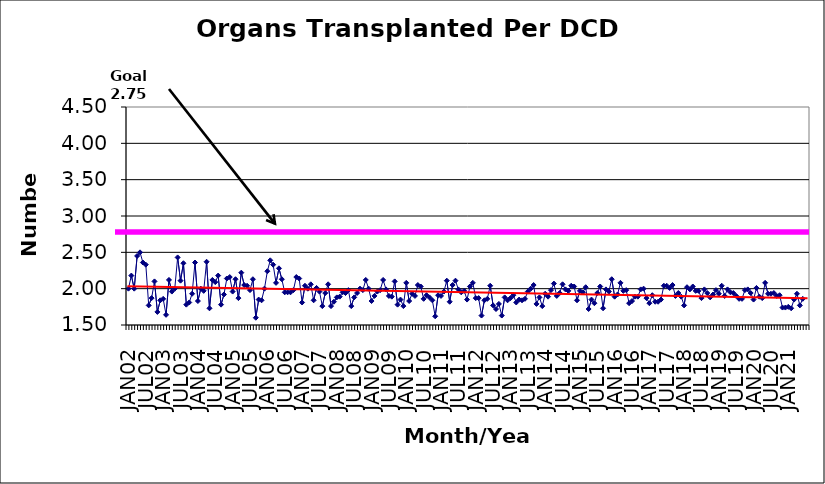
| Category | Series 0 |
|---|---|
| JAN02 | 2 |
| FEB02 | 2.18 |
| MAR02 | 2 |
| APR02 | 2.45 |
| MAY02 | 2.5 |
| JUN02 | 2.36 |
| JUL02 | 2.33 |
| AUG02 | 1.77 |
| SEP02 | 1.87 |
| OCT02 | 2.1 |
| NOV02 | 1.68 |
| DEC02 | 1.84 |
| JAN03 | 1.86 |
| FEB03 | 1.64 |
| MAR03 | 2.12 |
| APR03 | 1.96 |
| MAY03 | 2 |
| JUN03 | 2.43 |
| JUL03 | 2.11 |
| AUG03 | 2.35 |
| SEP03 | 1.78 |
| OCT03 | 1.81 |
| NOV03 | 1.93 |
| DEC03 | 2.36 |
| JAN04 | 1.83 |
| FEB04 | 2 |
| MAR04 | 1.97 |
| APR04 | 2.37 |
| MAY04 | 1.73 |
| JUN04 | 2.12 |
| JUL04 | 2.09 |
| AUG04 | 2.18 |
| SEP04 | 1.78 |
| OCT04 | 1.92 |
| NOV04 | 2.14 |
| DEC04 | 2.16 |
| JAN05 | 1.96 |
| FEB05 | 2.13 |
| MAR05 | 1.87 |
| APR05 | 2.22 |
| MAY05 | 2.05 |
| JUN05 | 2.04 |
| JUL05 | 1.98 |
| AUG05 | 2.13 |
| SEP05 | 1.6 |
| OCT05 | 1.85 |
| NOV05 | 1.84 |
| DEC05 | 2 |
| JAN06 | 2.24 |
| FEB06 | 2.39 |
| MAR06 | 2.33 |
| APR06 | 2.08 |
| MAY06 | 2.28 |
| JUN06 | 2.13 |
| JUL06 | 1.95 |
| AUG06 | 1.95 |
| SEP06 | 1.95 |
| OCT06 | 1.98 |
| NOV06 | 2.16 |
| DEC06 | 2.14 |
| JAN07 | 1.81 |
| FEB07 | 2.04 |
| MAR07 | 2 |
| APR07 | 2.06 |
| MAY07 | 1.84 |
| JUN07 | 2.01 |
| JUL07 | 1.96 |
| AUG07 | 1.76 |
| SEP07 | 1.94 |
| OCT07 | 2.06 |
| NOV07 | 1.76 |
| DEC07 | 1.82 |
| JAN08 | 1.88 |
| FEB08 | 1.89 |
| MAR08 | 1.95 |
| APR08 | 1.94 |
| MAY08 | 1.98 |
| JUN08 | 1.76 |
| JUL08 | 1.88 |
| AUG08 | 1.94 |
| SEP08 | 2 |
| OCT08 | 1.98 |
| NOV08 | 2.12 |
| DEC08 | 2 |
| JAN09 | 1.83 |
| FEB09 | 1.9 |
| MAR09 | 1.96 |
| APR09 | 1.98 |
| MAY09 | 2.12 |
| JUN09 | 1.99 |
| JUL09 | 1.9 |
| AUG09 | 1.89 |
| SEP09 | 2.1 |
| OCT09 | 1.78 |
| NOV09 | 1.85 |
| DEC09 | 1.76 |
| JAN10 | 2.08 |
| FEB10 | 1.83 |
| MAR10 | 1.93 |
| APR10 | 1.9 |
| MAY10 | 2.05 |
| JUN10 | 2.03 |
| JUL10 | 1.86 |
| AUG10 | 1.91 |
| SEP10 | 1.88 |
| OCT10 | 1.84 |
| NOV10 | 1.62 |
| DEC10 | 1.91 |
| JAN11 | 1.9 |
| FEB11 | 1.96 |
| MAR11 | 2.11 |
| APR11 | 1.82 |
| MAY11 | 2.05 |
| JUN11 | 2.11 |
| JUL11 | 1.99 |
| AUG11 | 1.95 |
| SEP11 | 1.97 |
| OCT11 | 1.85 |
| NOV11 | 2.03 |
| DEC11 | 2.08 |
| JAN12 | 1.87 |
| FEB12 | 1.87 |
| MAR12 | 1.63 |
| APR12 | 1.84 |
| MAY12 | 1.86 |
| JUN12 | 2.04 |
| JUL12 | 1.77 |
| AUG12 | 1.72 |
| SEP12 | 1.79 |
| OCT12 | 1.63 |
| NOV12 | 1.88 |
| DEC12 | 1.84 |
| JAN13 | 1.87 |
| FEB13 | 1.91 |
| MAR13 | 1.81 |
| APR13 | 1.85 |
| MAY13 | 1.84 |
| JUN13 | 1.86 |
| JUL13 | 1.96 |
| AUG13 | 2 |
| SEP13 | 2.05 |
| OCT13 | 1.79 |
| NOV13 | 1.88 |
| DEC13 | 1.76 |
| JAN14 | 1.93 |
| FEB14 | 1.89 |
| MAR14 | 1.98 |
| APR14 | 2.07 |
| MAY14 | 1.9 |
| JUN14 | 1.94 |
| JUL14 | 2.06 |
| AUG14 | 1.99 |
| SEP14 | 1.97 |
| OCT14 | 2.04 |
| NOV14 | 2.03 |
| DEC14 | 1.84 |
| JAN15 | 1.97 |
| FEB15 | 1.95 |
| MAR15 | 2.02 |
| APR15 | 1.72 |
| MAY15 | 1.85 |
| JUN15 | 1.8 |
| JUL15 | 1.94 |
| AUG15 | 2.03 |
| SEP15 | 1.73 |
| OCT15 | 1.99 |
| NOV15 | 1.96 |
| DEC15 | 2.13 |
| JAN16 | 1.89 |
| FEB16 | 1.92 |
| MAR16 | 2.08 |
| APR16 | 1.97 |
| MAY16 | 1.98 |
| JUN16 | 1.8 |
| JUL16 | 1.83 |
| AUG16 | 1.89 |
| SEP16 | 1.89 |
| OCT16 | 1.99 |
| NOV16 | 2 |
| DEC16 | 1.87 |
| JAN17 | 1.8 |
| FEB17 | 1.91 |
| MAR17 | 1.82 |
| APR17 | 1.82 |
| MAY17 | 1.85 |
| JUN17 | 2.04 |
| JUL17 | 2.04 |
| AUG17 | 2.01 |
| SEP17 | 2.05 |
| OCT17 | 1.9 |
| NOV17 | 1.94 |
| DEC17 | 1.89 |
| JAN18 | 1.77 |
| FEB18 | 2.02 |
| MAR18 | 1.99 |
| APR18 | 2.03 |
| MAY18 | 1.97 |
| JUN18 | 1.97 |
| JUL18 | 1.87 |
| AUG18 | 1.99 |
| SEP18 | 1.94 |
| OCT18 | 1.88 |
| NOV18 | 1.92 |
| DEC18 | 1.98 |
| JAN19 | 1.93 |
| FEB19 | 2.04 |
| MAR19 | 1.9 |
| APR19 | 1.99 |
| MAY19 | 1.95 |
| JUN19 | 1.94 |
| JUL19 | 1.9 |
| AUG19 | 1.86 |
| SEP19 | 1.86 |
| OCT19 | 1.98 |
| NOV19 | 1.99 |
| DEC19 | 1.94 |
| JAN20 | 1.85 |
| FEB20 | 2.01 |
| MAR20 | 1.89 |
| APR20 | 1.87 |
| MAY20 | 2.08 |
| JUN20 | 1.93 |
| JUL20 | 1.93 |
| AUG20 | 1.94 |
| SEP20 | 1.9 |
| OCT20 | 1.91 |
| NOV20 | 1.74 |
| DEC20 | 1.74 |
| JAN21 | 1.75 |
| FEB21 | 1.73 |
| MAR21 | 1.85 |
| APR21 | 1.93 |
| MAY21 | 1.77 |
| JUN21 | 1.86 |